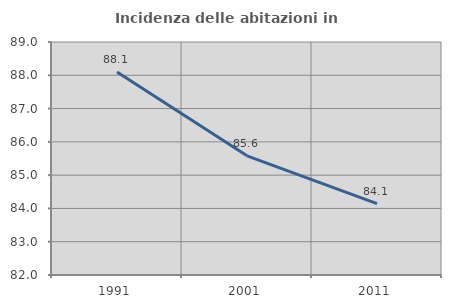
| Category | Incidenza delle abitazioni in proprietà  |
|---|---|
| 1991.0 | 88.102 |
| 2001.0 | 85.58 |
| 2011.0 | 84.142 |